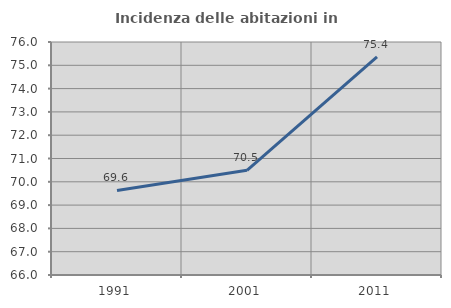
| Category | Incidenza delle abitazioni in proprietà  |
|---|---|
| 1991.0 | 69.627 |
| 2001.0 | 70.495 |
| 2011.0 | 75.359 |